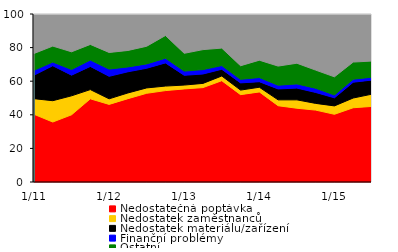
| Category | Nedostatečná poptávka | Nedostatek zaměstnanců | Nedostatek materiálu/zařízení    | Finanční problémy | Ostatní | Nejsou |
|---|---|---|---|---|---|---|
|  1/11 | 40.3 | 9.3 | 14 | 2.9 | 10 | 23.5 |
| 4 | 35.7 | 12.7 | 20.8 | 2.2 | 9.5 | 19.1 |
| 7 | 40 | 11.3 | 12.3 | 3.4 | 10.5 | 22.5 |
| 10 | 49.5 | 5.5 | 13.8 | 3.8 | 9.3 | 18.1 |
|  1/12 | 46.2 | 3.3 | 13.4 | 4.3 | 9.9 | 22.9 |
| 4 | 49.6 | 3.4 | 12.6 | 2.9 | 9.8 | 21.7 |
| 7 | 52.8 | 3.2 | 11.7 | 2.6 | 10.5 | 19.2 |
| 10 | 54.4 | 2.7 | 13.8 | 2.8 | 13.5 | 12.8 |
|  1/13 | 55.4 | 2.3 | 5.8 | 2.5 | 10.6 | 23.4 |
| 4 | 56.2 | 2.5 | 5.6 | 2.6 | 11.9 | 21.2 |
| 7 | 60.3 | 2.8 | 4 | 2.2 | 10.4 | 20.3 |
| 10 | 52 | 2.7 | 4.3 | 2.1 | 8.1 | 30.8 |
|  1/14 | 53.6 | 2.8 | 3.3 | 2.5 | 10.3 | 27.5 |
| 4 | 45.4 | 3.5 | 6.5 | 2.2 | 11.4 | 31 |
| 7 | 43.9 | 5 | 7 | 2.5 | 12.3 | 29.3 |
| 10 | 42.8 | 4 | 6.5 | 2.5 | 10.8 | 33.4 |
|  1/15 | 40.3 | 5 | 4.8 | 1.7 | 10.8 | 37.4 |
| 4 | 44.2 | 5.8 | 9.4 | 1.8 | 10.2 | 28.6 |
| 7 | 45 | 7.3 | 8.4 | 1.7 | 9.6 | 28 |